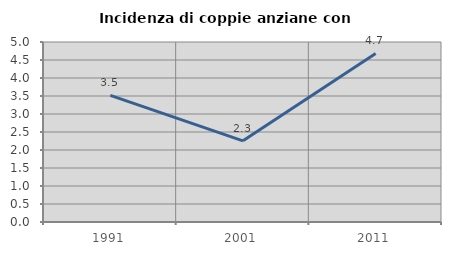
| Category | Incidenza di coppie anziane con figli |
|---|---|
| 1991.0 | 3.516 |
| 2001.0 | 2.256 |
| 2011.0 | 4.682 |